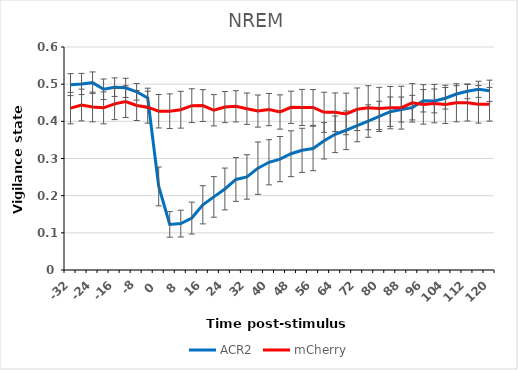
| Category | ACR2 | mCherry |
|---|---|---|
| -32.0 | 0.499 | 0.436 |
| -28.0 | 0.501 | 0.444 |
| -24.0 | 0.504 | 0.439 |
| -20.0 | 0.486 | 0.436 |
| -16.0 | 0.492 | 0.447 |
| -12.0 | 0.49 | 0.453 |
| -8.0 | 0.479 | 0.443 |
| -4.0 | 0.463 | 0.438 |
| 0.0 | 0.225 | 0.427 |
| 4.0 | 0.123 | 0.427 |
| 8.0 | 0.125 | 0.431 |
| 12.0 | 0.14 | 0.442 |
| 16.0 | 0.175 | 0.442 |
| 20.0 | 0.197 | 0.43 |
| 24.0 | 0.218 | 0.438 |
| 28.0 | 0.244 | 0.44 |
| 32.0 | 0.25 | 0.434 |
| 36.0 | 0.274 | 0.428 |
| 40.0 | 0.29 | 0.432 |
| 44.0 | 0.298 | 0.425 |
| 48.0 | 0.313 | 0.438 |
| 52.0 | 0.322 | 0.437 |
| 56.0 | 0.327 | 0.437 |
| 60.0 | 0.348 | 0.424 |
| 64.0 | 0.365 | 0.424 |
| 68.0 | 0.376 | 0.42 |
| 72.0 | 0.388 | 0.432 |
| 76.0 | 0.401 | 0.437 |
| 80.0 | 0.413 | 0.435 |
| 84.0 | 0.426 | 0.437 |
| 88.0 | 0.432 | 0.437 |
| 92.0 | 0.437 | 0.45 |
| 96.0 | 0.455 | 0.446 |
| 100.0 | 0.455 | 0.448 |
| 104.0 | 0.462 | 0.446 |
| 108.0 | 0.473 | 0.45 |
| 112.0 | 0.481 | 0.45 |
| 116.0 | 0.486 | 0.446 |
| 120.0 | 0.482 | 0.446 |